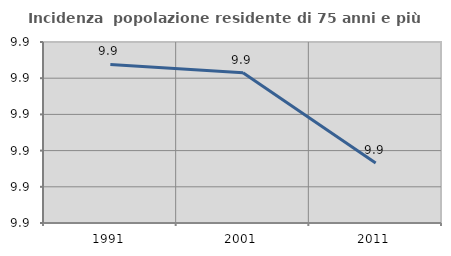
| Category | Incidenza  popolazione residente di 75 anni e più |
|---|---|
| 1991.0 | 9.914 |
| 2001.0 | 9.912 |
| 2011.0 | 9.887 |